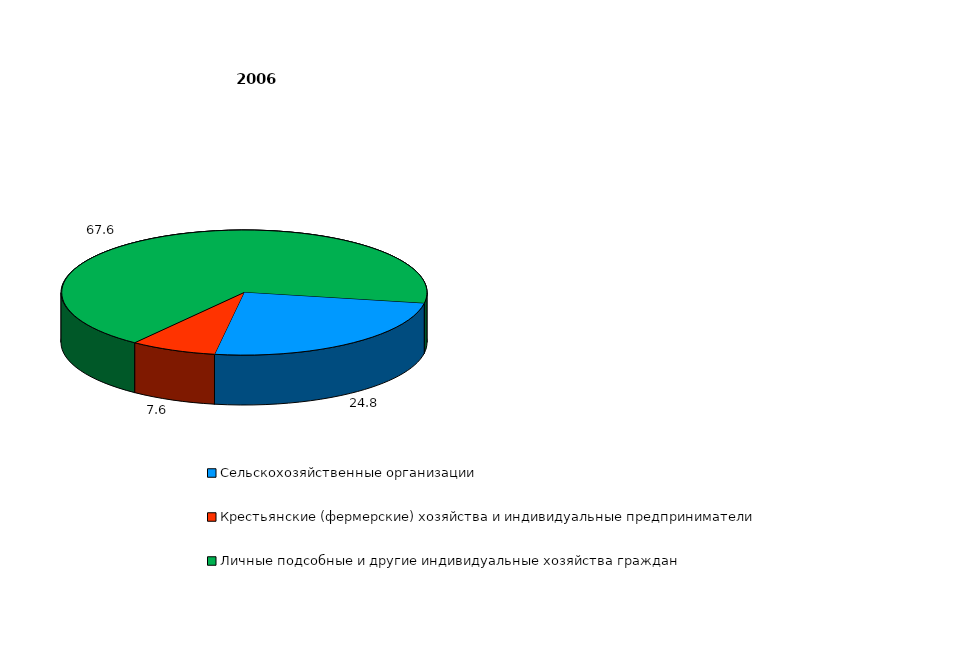
| Category | Series 0 |
|---|---|
| Сельскохозяйственные организации  | 24.8 |
| Крестьянские (фермерские) хозяйства и индивидуальные предприниматели  | 7.6 |
| Личные подсобные и другие индивидуальные хозяйства граждан  | 67.6 |